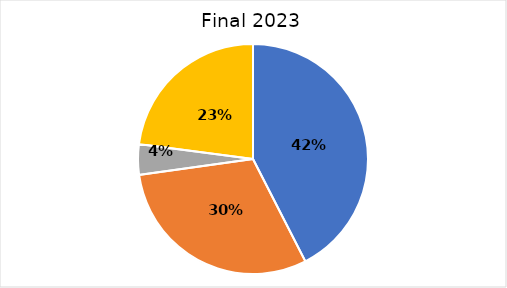
| Category | 2019 |
|---|---|
| Technical Analysis | 0.425 |
| Tool Development and Regional Coordination  | 0.303 |
| Demand Response | 0.043 |
| Administration | 0.229 |